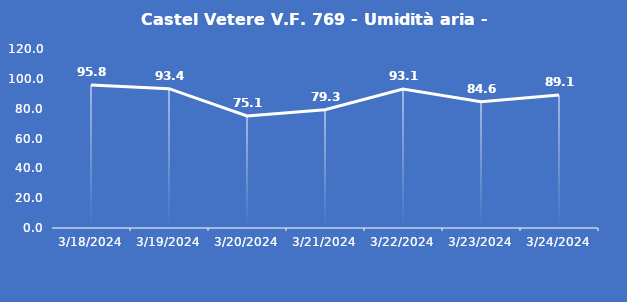
| Category | Castel Vetere V.F. 769 - Umidità aria - Grezzo (%) |
|---|---|
| 3/18/24 | 95.8 |
| 3/19/24 | 93.4 |
| 3/20/24 | 75.1 |
| 3/21/24 | 79.3 |
| 3/22/24 | 93.1 |
| 3/23/24 | 84.6 |
| 3/24/24 | 89.1 |